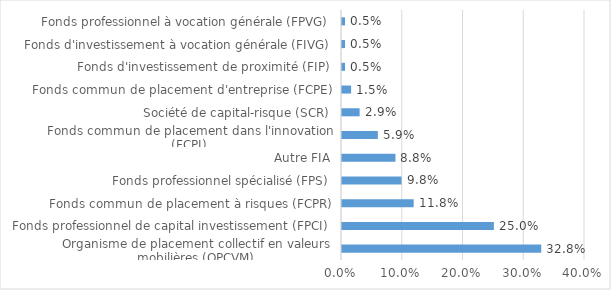
| Category | Series 0 |
|---|---|
| Organisme de placement collectif en valeurs mobilières (OPCVM) | 0.328 |
| Fonds professionnel de capital investissement (FPCI) | 0.25 |
| Fonds commun de placement à risques (FCPR) | 0.118 |
| Fonds professionnel spécialisé (FPS) | 0.098 |
| Autre FIA | 0.088 |
| Fonds commun de placement dans l'innovation (FCPI) | 0.059 |
| Société de capital-risque (SCR) | 0.029 |
| Fonds commun de placement d'entreprise (FCPE) | 0.015 |
| Fonds d'investissement de proximité (FIP) | 0.005 |
| Fonds d'investissement à vocation générale (FIVG) | 0.005 |
| Fonds professionnel à vocation générale (FPVG) | 0.005 |